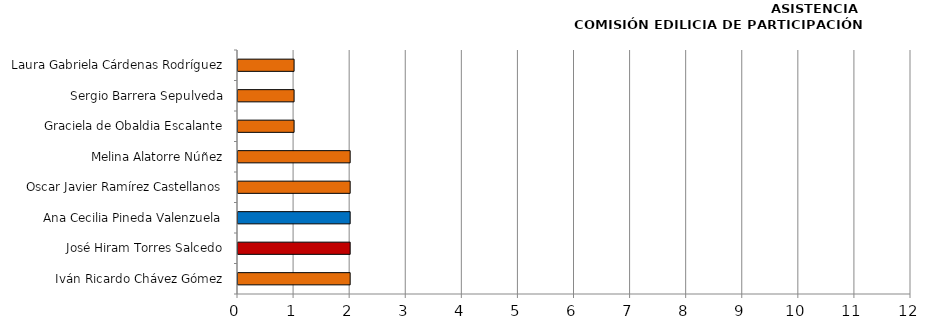
| Category | Series 0 |
|---|---|
| Iván Ricardo Chávez Gómez | 2 |
| José Hiram Torres Salcedo | 2 |
| Ana Cecilia Pineda Valenzuela | 2 |
| Oscar Javier Ramírez Castellanos | 2 |
| Melina Alatorre Núñez | 2 |
| Graciela de Obaldia Escalante | 1 |
| Sergio Barrera Sepulveda | 1 |
| Laura Gabriela Cárdenas Rodríguez | 1 |